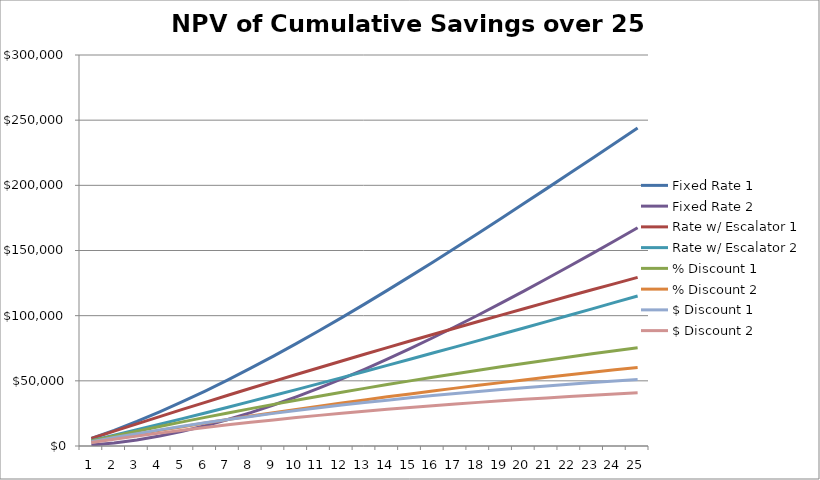
| Category | Fixed Rate 1 | Fixed Rate 2 | Rate w/ Escalator 1 | Rate w/ Escalator 2 | % Discount 1 | % Discount 2 | $ Discount 1 | $ Discount 2 |
|---|---|---|---|---|---|---|---|---|
| 0 | 5738.52 | 791.52 | 5738.52 | 4089.52 | 3871.852 | 3097.482 | 3298 | 2638.4 |
| 1 | 12043.153 | 2363.206 | 11412.093 | 8236.718 | 7657.613 | 6126.091 | 6453.298 | 5162.638 |
| 2 | 18874.812 | 4666.708 | 17024.169 | 12439.886 | 11359.55 | 9087.64 | 9472.069 | 7577.655 |
| 3 | 26196.364 | 7656.034 | 22577.941 | 16697.245 | 14979.856 | 11983.885 | 12360.22 | 9888.176 |
| 4 | 33972.539 | 11287.435 | 28076.365 | 21006.952 | 18520.656 | 14816.525 | 15123.403 | 12098.722 |
| 5 | 42169.844 | 15519.308 | 33522.168 | 25367.11 | 21984.009 | 17587.207 | 17767.025 | 14213.62 |
| 6 | 50756.486 | 20312.097 | 38917.866 | 29775.773 | 25371.908 | 20297.526 | 20296.259 | 16237.007 |
| 7 | 59702.287 | 25628.204 | 44265.777 | 34230.958 | 28686.284 | 22949.027 | 22716.056 | 18172.844 |
| 8 | 68978.617 | 31431.893 | 49568.031 | 38730.65 | 31929.011 | 25543.209 | 25031.149 | 20024.919 |
| 9 | 78558.316 | 37689.21 | 54826.583 | 43272.808 | 35101.902 | 28081.522 | 27246.071 | 21796.857 |
| 10 | 88415.633 | 44367.901 | 60043.225 | 47855.372 | 38206.717 | 30565.374 | 29365.154 | 23492.123 |
| 11 | 98526.154 | 51437.334 | 65219.594 | 52476.267 | 41245.162 | 32996.13 | 31392.547 | 25114.037 |
| 12 | 108866.746 | 58868.424 | 70357.184 | 57133.411 | 44218.89 | 35375.112 | 33332.215 | 26665.772 |
| 13 | 119415.495 | 66633.561 | 75457.355 | 61824.719 | 47129.505 | 37703.604 | 35187.956 | 28150.365 |
| 14 | 130151.648 | 74706.548 | 80521.341 | 66548.105 | 49978.565 | 39982.852 | 36963.4 | 29570.72 |
| 15 | 141055.561 | 83062.528 | 85550.258 | 71301.49 | 52767.578 | 42214.063 | 38662.022 | 30929.618 |
| 16 | 152108.648 | 91677.928 | 90545.114 | 76082.803 | 55498.011 | 44398.409 | 40287.146 | 32229.717 |
| 17 | 163293.328 | 100530.399 | 95506.816 | 80889.987 | 58171.285 | 46537.028 | 41841.952 | 33473.562 |
| 18 | 174592.981 | 109598.756 | 100436.174 | 85720.998 | 60788.781 | 48631.025 | 43329.483 | 34663.587 |
| 19 | 185991.902 | 118862.927 | 105333.911 | 90573.813 | 63351.84 | 50681.472 | 44752.65 | 35802.12 |
| 20 | 197475.259 | 128303.903 | 110200.67 | 95446.43 | 65861.763 | 52689.41 | 46114.237 | 36891.39 |
| 21 | 209029.047 | 137903.683 | 115037.015 | 100336.872 | 68319.814 | 54655.851 | 47416.91 | 37933.528 |
| 22 | 220640.057 | 147645.232 | 119843.443 | 105243.185 | 70727.222 | 56581.778 | 48663.216 | 38930.573 |
| 23 | 232295.83 | 157512.435 | 124620.384 | 110163.447 | 73085.179 | 58468.144 | 49855.596 | 39884.477 |
| 24 | 243984.626 | 167490.051 | 129368.21 | 115095.764 | 75394.846 | 60315.877 | 50996.383 | 40797.107 |